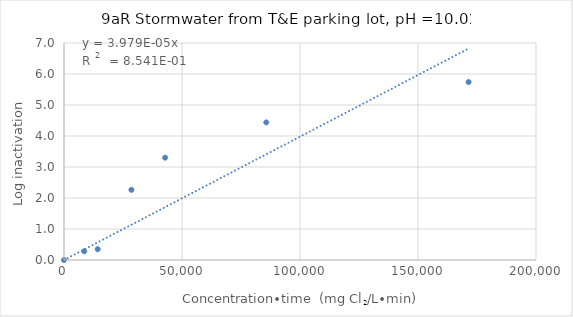
| Category | Series 0 |
|---|---|
| 0.0 | 0 |
| 8571.428571428572 | 0.282 |
| 14285.714285714286 | 0.349 |
| 28571.428571428572 | 2.263 |
| 42857.14285714286 | 3.301 |
| 85714.28571428572 | 4.439 |
| 171428.57142857145 | 5.74 |